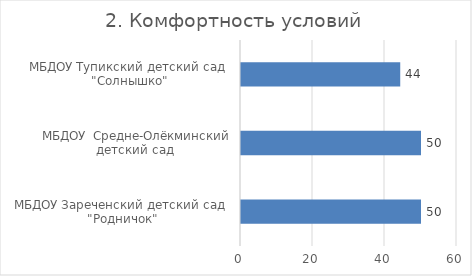
| Category | 2. Комфортность условий |
|---|---|
| МБДОУ Зареченский детский сад  "Родничок" | 50 |
| МБДОУ  Средне-Олёкминский детский сад  | 50 |
| МБДОУ Тупикский детский сад  "Солнышко" | 44.231 |